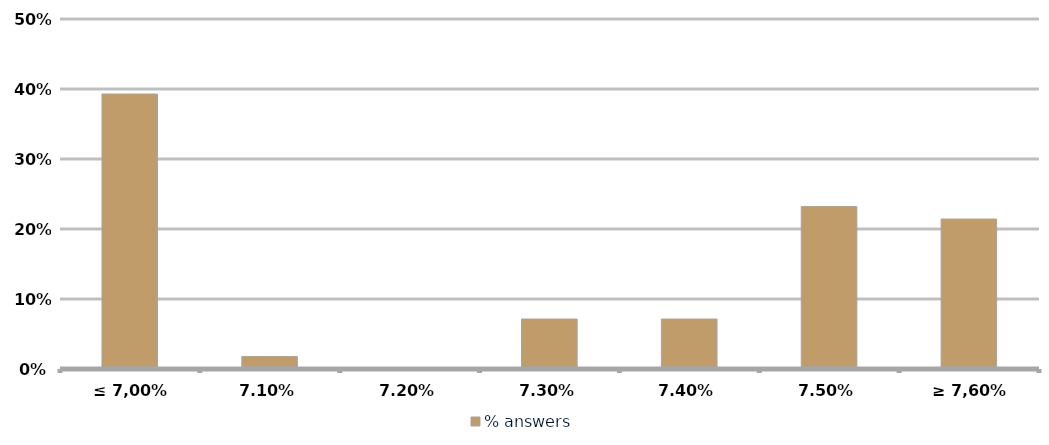
| Category | % answers |
|---|---|
| ≤ 7,00% | 0.393 |
| 7,10% | 0.018 |
| 7,20% | 0 |
| 7,30% | 0.071 |
| 7,40% | 0.071 |
| 7,50% | 0.232 |
| ≥ 7,60% | 0.214 |